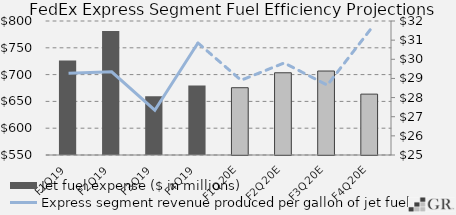
| Category | Jet fuel expense ($ in millions) |
|---|---|
|  F1Q19  | 726.404 |
|  F2Q19  | 781.141 |
|  F3Q19  | 659.784 |
|  F4Q19  | 679.456 |
|  F1Q20E  | 675.527 |
|  F2Q20E  | 703.4 |
|  F3Q20E  | 706.67 |
|  F4Q20E  | 663.552 |